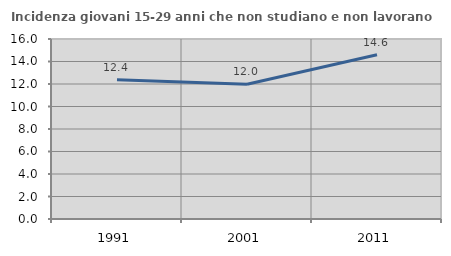
| Category | Incidenza giovani 15-29 anni che non studiano e non lavorano  |
|---|---|
| 1991.0 | 12.387 |
| 2001.0 | 11.97 |
| 2011.0 | 14.6 |